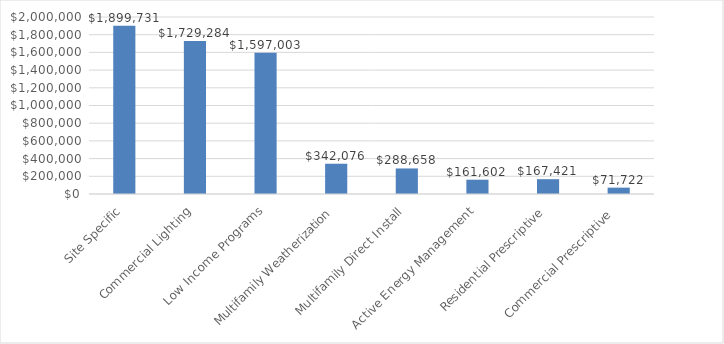
| Category | 4 year NEIs |
|---|---|
| Site Specific | 1899730.664 |
| Commercial Lighting | 1729283.923 |
| Low Income Programs | 1597003.189 |
| Multifamily Weatherization | 342076.039 |
| Multifamily Direct Install | 288657.989 |
| Active Energy Management | 161601.843 |
| Residential Prescriptive | 167420.565 |
| Commercial Prescriptive  | 71722.234 |